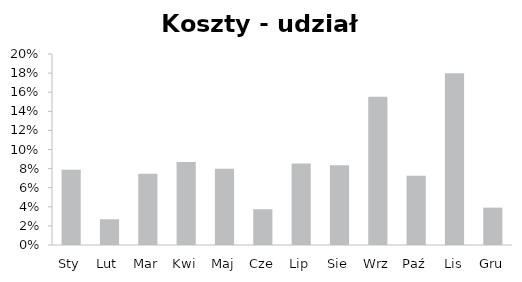
| Category | Koszty - udział procentowy |
|---|---|
| Sty | 0.079 |
| Lut | 0.027 |
| Mar | 0.075 |
| Kwi | 0.087 |
| Maj | 0.08 |
| Cze | 0.037 |
| Lip | 0.085 |
| Sie | 0.084 |
| Wrz | 0.155 |
| Paź | 0.072 |
| Lis | 0.18 |
| Gru | 0.039 |